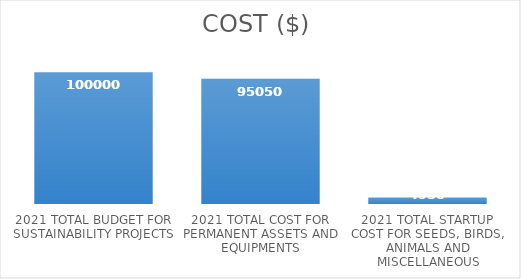
| Category | COST ($) |
|---|---|
| 2021 TOTAL BUDGET FOR SUSTAINABILITY PROJECTS | 100000 |
| 2021 TOTAL COST FOR PERMANENT ASSETS AND EQUIPMENTS | 95050 |
| 2021 TOTAL STARTUP COST FOR SEEDS, BIRDS, ANIMALS AND MISCELLANEOUS | 4950 |